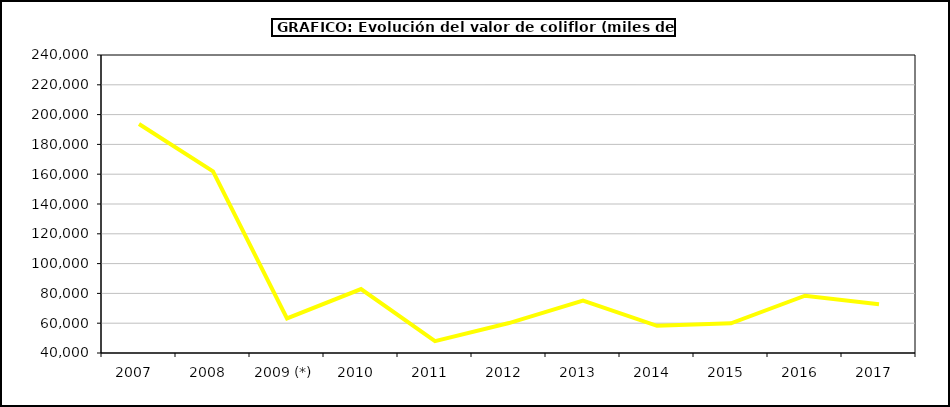
| Category | Valor |
|---|---|
| 2007  | 193667.735 |
| 2008  | 161966.625 |
| 2009 (*) | 63214.224 |
| 2010  | 82925.588 |
| 2011  | 47916.69 |
| 2012  | 60097.372 |
| 2013  | 75196.05 |
| 2014  | 58249.149 |
| 2015  | 59963 |
| 2016  | 78452 |
| 2017  | 72692.622 |